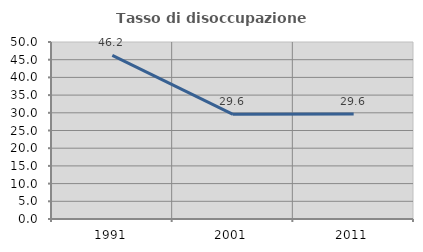
| Category | Tasso di disoccupazione giovanile  |
|---|---|
| 1991.0 | 46.237 |
| 2001.0 | 29.56 |
| 2011.0 | 29.63 |